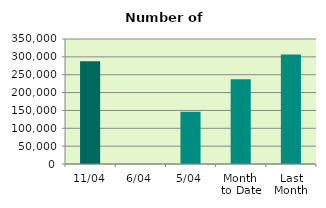
| Category | Series 0 |
|---|---|
| 11/04 | 287430 |
| 6/04 | 0 |
| 5/04 | 146576 |
| Month 
to Date | 237588 |
| Last
Month | 306734.174 |